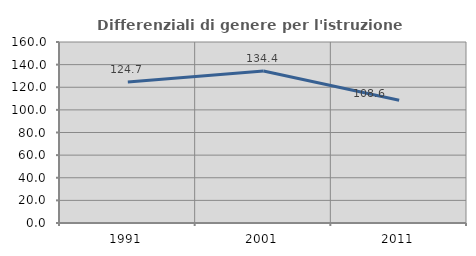
| Category | Differenziali di genere per l'istruzione superiore |
|---|---|
| 1991.0 | 124.733 |
| 2001.0 | 134.434 |
| 2011.0 | 108.566 |